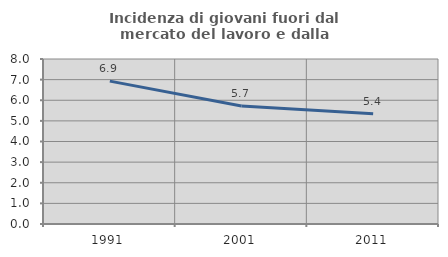
| Category | Incidenza di giovani fuori dal mercato del lavoro e dalla formazione  |
|---|---|
| 1991.0 | 6.927 |
| 2001.0 | 5.721 |
| 2011.0 | 5.351 |